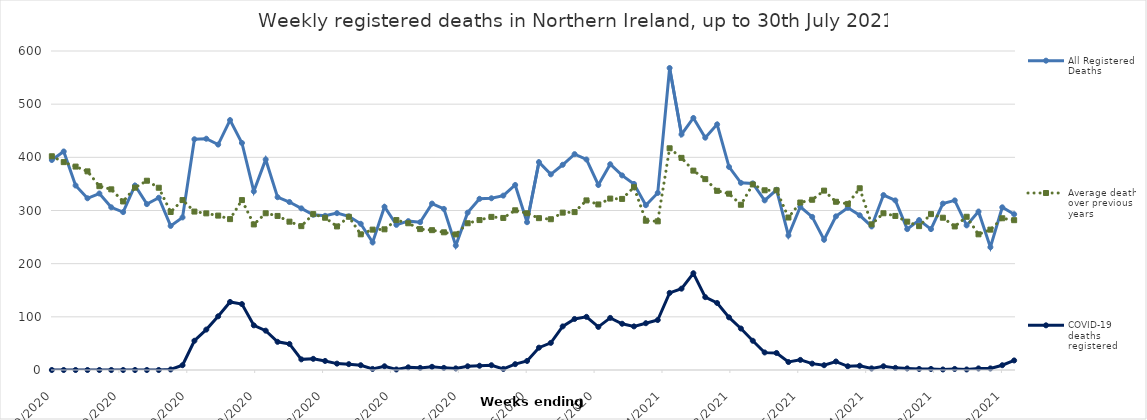
| Category | All Registered Deaths | Average deaths over previous 5 years | COVID-19 deaths registered |
|---|---|---|---|
| 1/10/20 | 395 | 402 | 0 |
| 1/17/20 | 411 | 391 | 0 |
| 1/24/20 | 347 | 382.6 | 0 |
| 1/31/20 | 323 | 373.6 | 0 |
| 2/7/20 | 332 | 345.8 | 0 |
| 2/14/20 | 306 | 339.8 | 0 |
| 2/21/20 | 297 | 317 | 0 |
| 2/28/20 | 347 | 343 | 0 |
| 3/6/20 | 312 | 356 | 0 |
| 3/13/20 | 324 | 342.8 | 0 |
| 3/20/20 | 271 | 297.2 | 1 |
| 3/27/20 | 287 | 319.6 | 9 |
| 4/3/20 | 434 | 298 | 55 |
| 4/10/20 | 435 | 294.6 | 76 |
| 4/17/20 | 424 | 290.4 | 101 |
| 4/24/20 | 470 | 283.8 | 128 |
| 5/1/20 | 427 | 319.6 | 124 |
| 5/8/20 | 336 | 273.8 | 84 |
| 5/15/20 | 396 | 294.8 | 74 |
| 5/22/20 | 325 | 289.8 | 53 |
| 5/29/20 | 316 | 279 | 49 |
| 6/5/20 | 304 | 270.6 | 20 |
| 6/12/20 | 292 | 293.2 | 21 |
| 6/19/20 | 290 | 286.4 | 17 |
| 6/26/20 | 295 | 270 | 12 |
| 7/3/20 | 289 | 288.2 | 11 |
| 7/10/20 | 275 | 255.2 | 9 |
| 7/17/20 | 240 | 264 | 2 |
| 7/24/20 | 307 | 264.6 | 7 |
| 7/31/20 | 273 | 282 | 1 |
| 8/7/20 | 280 | 276 | 5 |
| 8/14/20 | 278 | 265 | 4 |
| 8/21/20 | 313 | 263 | 6 |
| 8/28/20 | 303 | 259 | 4 |
| 9/4/20 | 234 | 255 | 3 |
| 9/11/20 | 296 | 276 | 7 |
| 9/18/20 | 322 | 282 | 8 |
| 9/25/20 | 323 | 288 | 9 |
| 10/2/20 | 328 | 286 | 2 |
| 10/9/20 | 348 | 300.4 | 11 |
| 10/16/20 | 278 | 294.8 | 17 |
| 10/23/20 | 391 | 285.6 | 42 |
| 10/30/20 | 368 | 283.6 | 51 |
| 11/6/20 | 386 | 296 | 82 |
| 11/13/20 | 406 | 297 | 96 |
| 11/20/20 | 396 | 319 | 100 |
| 11/27/20 | 348 | 311.4 | 81 |
| 12/4/20 | 387 | 322.4 | 98 |
| 12/11/20 | 366 | 321.8 | 87 |
| 12/18/20 | 350 | 343.8 | 82 |
| 12/25/20 | 310 | 280.8 | 88 |
| 1/1/21 | 333 | 279.6 | 94 |
| 1/8/21 | 568 | 417 | 145 |
| 1/15/21 | 443 | 399 | 153 |
| 1/22/21 | 474 | 375 | 182 |
| 1/29/21 | 437 | 359 | 137 |
| 2/5/21 | 462 | 337 | 126 |
| 2/12/21 | 382 | 331.6 | 99 |
| 2/19/21 | 352 | 310.8 | 78 |
| 2/26/21 | 351 | 349 | 55 |
| 3/5/21 | 319 | 338 | 33 |
| 3/12/21 | 339 | 338 | 32 |
| 3/19/21 | 253 | 286.8 | 15 |
| 3/26/21 | 307 | 315 | 19 |
| 4/2/21 | 288 | 320.2 | 12 |
| 4/9/21 | 245 | 337.4 | 9 |
| 4/16/21 | 289 | 316.4 | 16 |
| 4/23/21 | 305 | 312.4 | 7 |
| 4/30/21 | 291 | 341.8 | 8 |
| 5/7/21 | 270 | 274 | 3 |
| 5/14/21 | 329 | 294.8 | 7 |
| 5/21/21 | 319 | 289.8 | 4 |
| 5/28/21 | 265 | 279 | 3 |
| 6/4/21 | 282 | 270.6 | 2 |
| 6/11/21 | 265 | 293.2 | 2 |
| 6/18/21 | 313 | 286.4 | 1 |
| 6/25/21 | 319 | 270 | 2 |
| 7/2/21 | 272 | 288.2 | 1 |
| 7/9/21 | 298 | 255.2 | 3 |
| 7/16/21 | 231 | 264 | 3 |
| 7/23/21 | 306 | 285.4 | 9 |
| 7/30/21 | 293 | 281.8 | 18 |